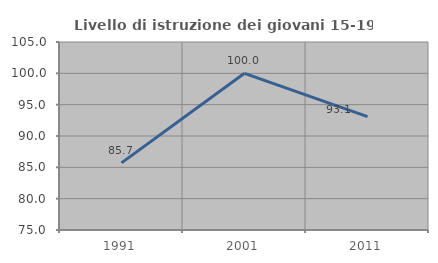
| Category | Livello di istruzione dei giovani 15-19 anni |
|---|---|
| 1991.0 | 85.714 |
| 2001.0 | 100 |
| 2011.0 | 93.103 |